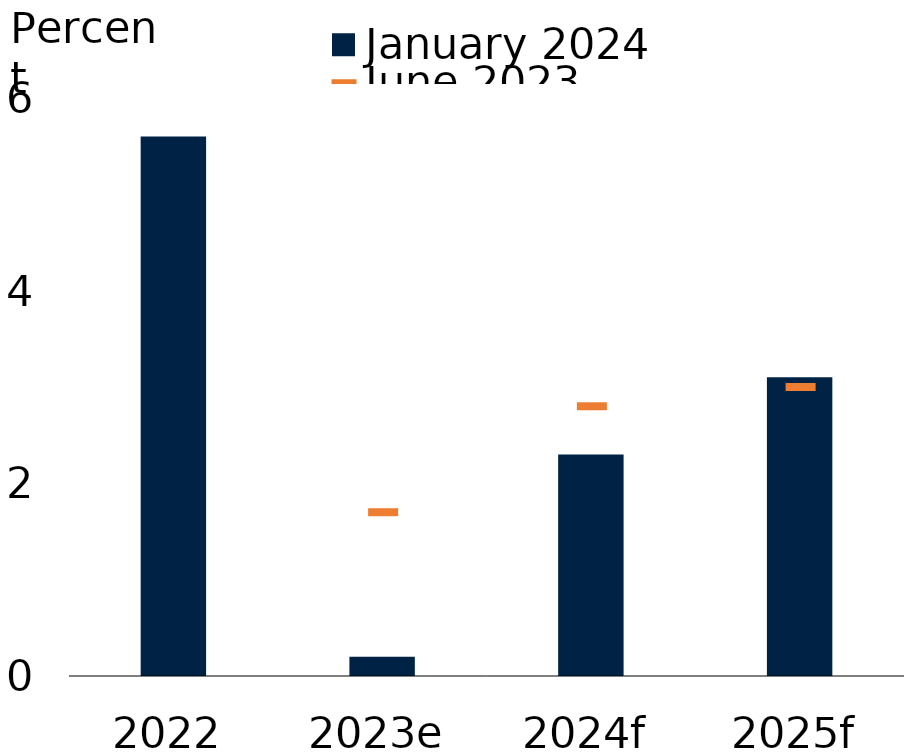
| Category | January 2024 |
|---|---|
| 2022 | 5.6 |
| 2023e | 0.2 |
| 2024f | 2.3 |
| 2025f | 3.1 |